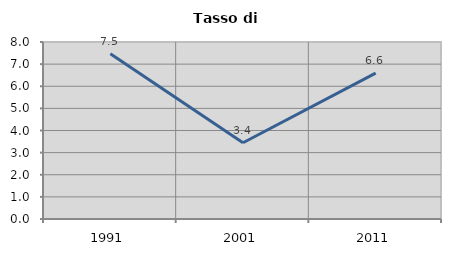
| Category | Tasso di disoccupazione   |
|---|---|
| 1991.0 | 7.474 |
| 2001.0 | 3.448 |
| 2011.0 | 6.591 |